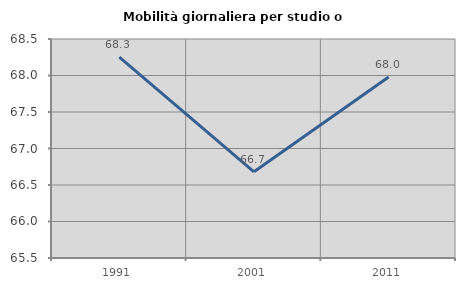
| Category | Mobilità giornaliera per studio o lavoro |
|---|---|
| 1991.0 | 68.252 |
| 2001.0 | 66.681 |
| 2011.0 | 67.98 |